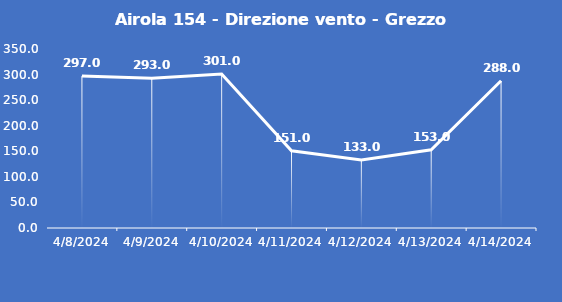
| Category | Airola 154 - Direzione vento - Grezzo (°N) |
|---|---|
| 4/8/24 | 297 |
| 4/9/24 | 293 |
| 4/10/24 | 301 |
| 4/11/24 | 151 |
| 4/12/24 | 133 |
| 4/13/24 | 153 |
| 4/14/24 | 288 |